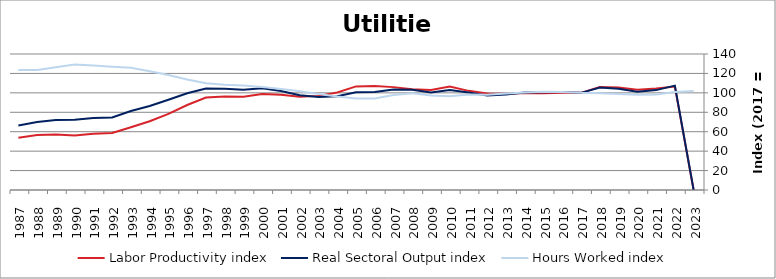
| Category | Labor Productivity index | Real Sectoral Output index | Hours Worked index |
|---|---|---|---|
| 2023.0 | 0 | 0 | 101.981 |
| 2022.0 | 106.515 | 107.425 | 100.854 |
| 2021.0 | 104.53 | 102.822 | 98.366 |
| 2020.0 | 103.327 | 101.261 | 98.001 |
| 2019.0 | 105.504 | 104.188 | 98.754 |
| 2018.0 | 105.922 | 105.409 | 99.515 |
| 2017.0 | 100 | 100 | 100 |
| 2016.0 | 100.022 | 101.01 | 100.988 |
| 2015.0 | 99.534 | 100.752 | 101.223 |
| 2014.0 | 99.815 | 100.262 | 100.448 |
| 2013.0 | 99.138 | 98.397 | 99.252 |
| 2012.0 | 99.297 | 97.394 | 98.084 |
| 2011.0 | 102.063 | 100.428 | 98.398 |
| 2010.0 | 106.509 | 102.861 | 96.574 |
| 2009.0 | 102.954 | 100.283 | 97.405 |
| 2008.0 | 103.833 | 103.282 | 99.469 |
| 2007.0 | 105.899 | 103.508 | 97.742 |
| 2006.0 | 107.032 | 100.771 | 94.15 |
| 2005.0 | 106.638 | 100.522 | 94.265 |
| 2004.0 | 100.391 | 96.6 | 96.224 |
| 2003.0 | 96.894 | 95.645 | 98.711 |
| 2002.0 | 95.966 | 97.575 | 101.676 |
| 2001.0 | 98.083 | 101.953 | 103.945 |
| 2000.0 | 98.862 | 104.739 | 105.944 |
| 1999.0 | 95.941 | 103.317 | 107.689 |
| 1998.0 | 96.178 | 104.193 | 108.334 |
| 1997.0 | 95.16 | 104.571 | 109.89 |
| 1996.0 | 87.521 | 99.528 | 113.719 |
| 1995.0 | 78.427 | 92.86 | 118.404 |
| 1994.0 | 70.765 | 86.497 | 122.231 |
| 1993.0 | 64.589 | 81.28 | 125.843 |
| 1992.0 | 58.78 | 74.603 | 126.92 |
| 1991.0 | 57.825 | 74.155 | 128.241 |
| 1990.0 | 56.049 | 72.403 | 129.177 |
| 1989.0 | 57.043 | 72.023 | 126.261 |
| 1988.0 | 56.592 | 69.899 | 123.514 |
| 1987.0 | 53.799 | 66.452 | 123.518 |